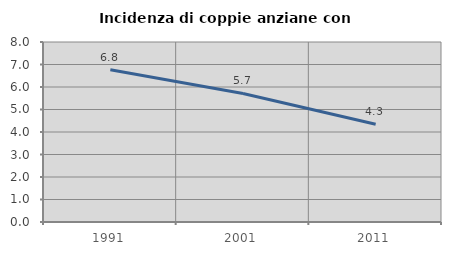
| Category | Incidenza di coppie anziane con figli |
|---|---|
| 1991.0 | 6.771 |
| 2001.0 | 5.714 |
| 2011.0 | 4.348 |